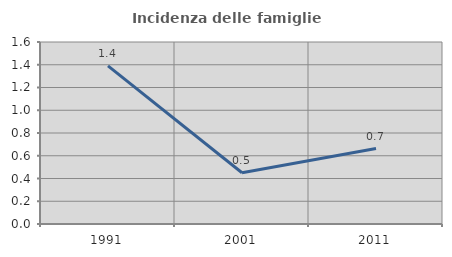
| Category | Incidenza delle famiglie numerose |
|---|---|
| 1991.0 | 1.39 |
| 2001.0 | 0.45 |
| 2011.0 | 0.663 |